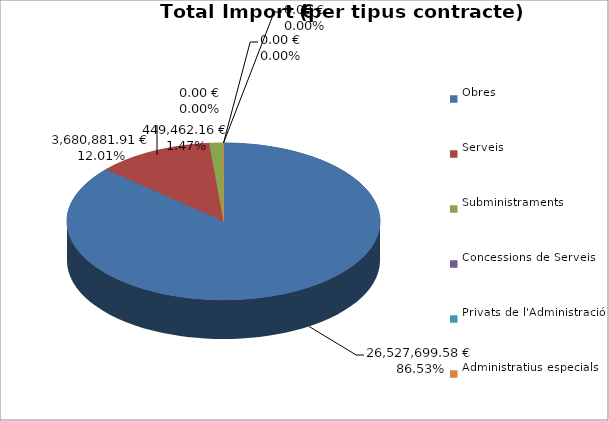
| Category | Total preu
(amb IVA) |
|---|---|
| Obres | 26527699.581 |
| Serveis | 3680881.909 |
| Subministraments | 449462.161 |
| Concessions de Serveis | 0 |
| Privats de l'Administració | 0 |
| Administratius especials | 0 |